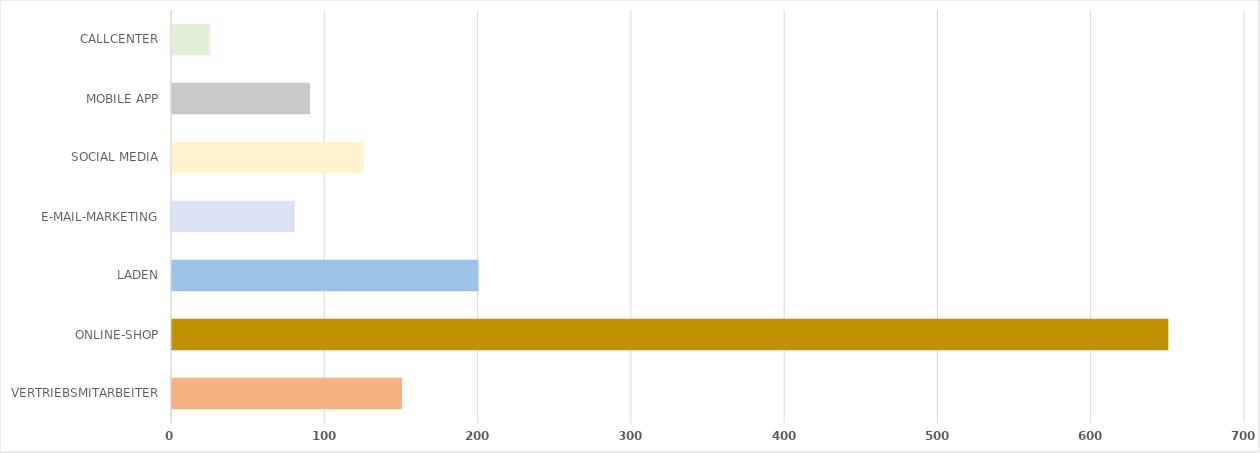
| Category | Series 0 |
|---|---|
| VERTRIEBSMITARBEITER | 150 |
| ONLINE-SHOP | 650 |
| LADEN | 200 |
| E-MAIL-MARKETING | 80 |
| SOCIAL MEDIA | 125 |
| MOBILE APP | 90 |
| CALLCENTER | 25 |